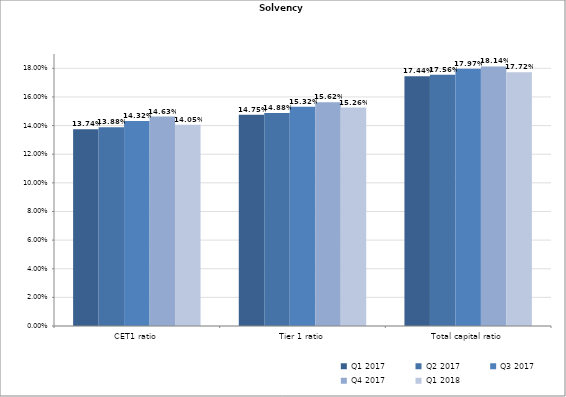
| Category | Q1 2017 | Q2 2017 | Q3 2017 | Q4 2017 | Q1 2018 |
|---|---|---|---|---|---|
| CET1 ratio | 0.137 | 0.139 | 0.143 | 0.146 | 0.141 |
| Tier 1 ratio | 0.147 | 0.149 | 0.153 | 0.156 | 0.153 |
| Total capital ratio | 0.174 | 0.176 | 0.18 | 0.181 | 0.177 |